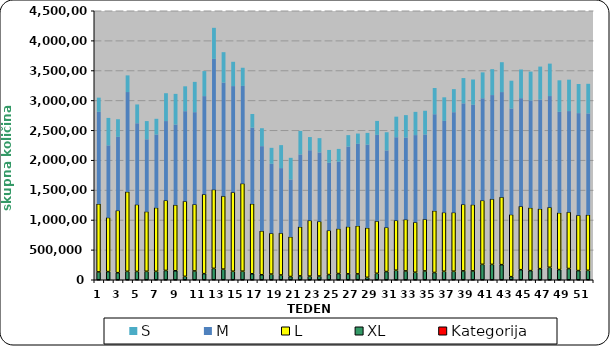
| Category | Kategorija | XL | L | M | S |
|---|---|---|---|---|---|
| 0 | 1 | 130985 | 1139834 | 1542530 | 236942 |
| 1 | 2 | 136560 | 904657 | 1210711 | 459549 |
| 2 | 3 | 118168 | 1042782 | 1233797 | 294923 |
| 3 | 4 | 140582 | 1332385 | 1671270 | 278751 |
| 4 | 5 | 139284 | 1120243 | 1362502 | 314537 |
| 5 | 6 | 140885 | 1000614 | 1212205 | 304857 |
| 6 | 7 | 140651 | 1065868 | 1226478 | 263667 |
| 7 | 8 | 155522 | 1175067 | 1328079 | 465975 |
| 8 | 9 | 150151 | 1102939 | 1347306 | 513159 |
| 9 | 10 | 56480 | 1259931 | 1507677 | 416184 |
| 10 | 11 | 147383 | 1115726 | 1544492 | 506611 |
| 11 | 12 | 102274 | 1329059 | 1644651 | 418661 |
| 12 | 13 | 190222 | 1320713 | 2188038 | 519614 |
| 13 | 14 | 177846 | 1223480 | 1900645 | 509257 |
| 14 | 15 | 142250 | 1323582 | 1777856 | 406360 |
| 15 | 16 | 143002 | 1468837 | 1634928 | 303793 |
| 16 | 17 | 100052 | 1171916 | 1276987 | 227842 |
| 17 | 18 | 84050 | 734333 | 1420615 | 299919 |
| 18 | 19 | 94421 | 685660 | 1163045 | 267961 |
| 19 | 20 | 79854 | 703465 | 1088418 | 384492 |
| 20 | 21 | 53733 | 665925 | 961336 | 362884 |
| 21 | 22 | 64507 | 822230 | 1213440 | 393731 |
| 22 | 23 | 60357 | 934037 | 1176446 | 220098 |
| 23 | 24 | 61961 | 915660 | 1155847 | 239577 |
| 24 | 25 | 87270 | 739867 | 1133299 | 215253 |
| 25 | 26 | 103617 | 751614 | 1123521 | 214184 |
| 26 | 27 | 98991 | 789724 | 1342795 | 192193 |
| 27 | 28 | 97723 | 805866 | 1374376 | 172302 |
| 28 | 29 | 40902 | 828526 | 1395097 | 196383 |
| 29 | 30 | 107363 | 876556 | 1443953 | 233222 |
| 30 | 31 | 137240 | 740498 | 1289805 | 304355 |
| 31 | 32 | 159418 | 835565 | 1393075 | 344213 |
| 32 | 33 | 147870 | 862329 | 1373060 | 374987 |
| 33 | 34 | 124983 | 838820 | 1460128 | 388608 |
| 34 | 35 | 147830 | 867261 | 1418660 | 397552 |
| 35 | 36 | 121329 | 1033616 | 1618096 | 438660 |
| 36 | 37 | 141876 | 985201 | 1534296 | 394654 |
| 37 | 38 | 142507 | 984792 | 1680016 | 385901 |
| 38 | 39 | 148388 | 1114267 | 1692430 | 423054 |
| 39 | 40 | 148607 | 1109189 | 1673312 | 423202 |
| 40 | 41 | 257749 | 1071202 | 1711042 | 433871 |
| 41 | 42 | 257024 | 1095885 | 1740443 | 433723 |
| 42 | 43 | 252551 | 1132683 | 1758455 | 499908 |
| 43 | 44 | 51746 | 1039858 | 1777411 | 464892 |
| 44 | 45 | 168106 | 1063848 | 1809679 | 479795 |
| 45 | 46 | 152487 | 1053123 | 1799609 | 481279 |
| 46 | 47 | 185692 | 1002344 | 1830584 | 551440 |
| 47 | 48 | 208039 | 1006109 | 1862989 | 542542 |
| 48 | 49 | 170265 | 951391 | 1690976 | 527752 |
| 49 | 50 | 187689 | 946942 | 1691067 | 525432 |
| 50 | 51 | 153566 | 928200 | 1709734 | 487122 |
| 51 | 52 | 157441 | 930054 | 1698758 | 496076 |